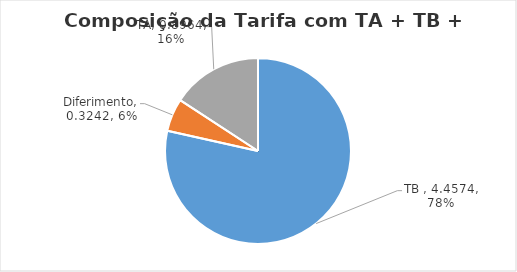
| Category | Series 0 |
|---|---|
| TB  | 4.457 |
| Diferimento | 0.324 |
| TA | 0.896 |